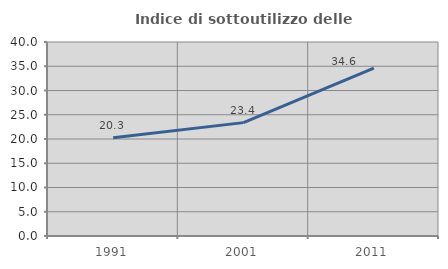
| Category | Indice di sottoutilizzo delle abitazioni  |
|---|---|
| 1991.0 | 20.26 |
| 2001.0 | 23.377 |
| 2011.0 | 34.614 |